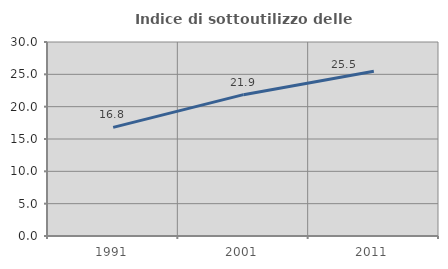
| Category | Indice di sottoutilizzo delle abitazioni  |
|---|---|
| 1991.0 | 16.795 |
| 2001.0 | 21.857 |
| 2011.0 | 25.48 |